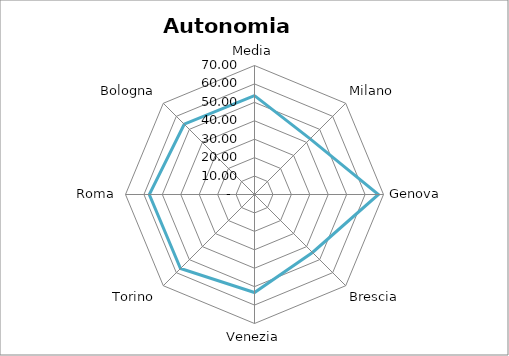
| Category | Autonomia impositiva |
|---|---|
| Media | 53.641 |
| Milano | 42.74 |
| Genova | 67.25 |
| Brescia | 44.51 |
| Venezia | 53.18 |
| Torino | 56.8 |
| Roma | 57.08 |
| Bologna | 53.93 |